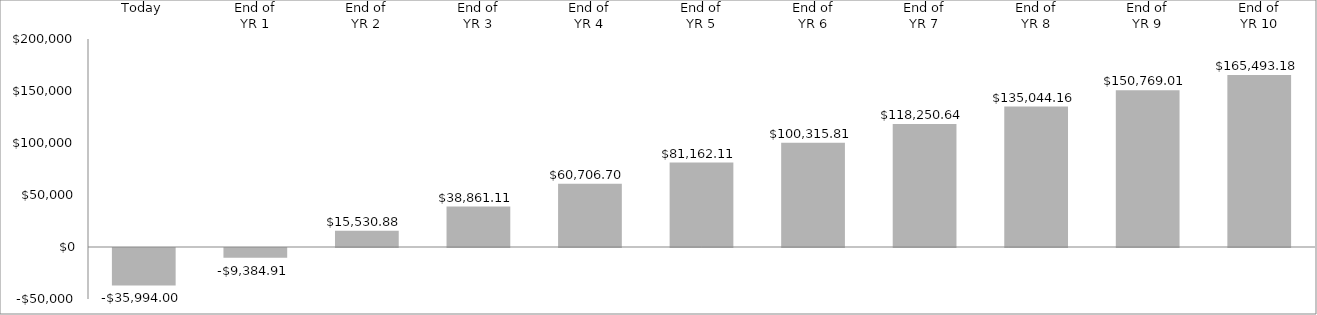
| Category | ($35,994.00) $26,609  $24,916  $23,330  $21,846  $20,455  $19,154  $17,935  $16,794  $15,725  $14,724  |
|---|---|
| Today | -35994 |
| End of
YR 1 | -9384.909 |
| End of
YR 2 | 15530.876 |
| End of
YR 3 | 38861.111 |
| End of
YR 4 | 60706.695 |
| End of
YR 5 | 81162.105 |
| End of
YR 6 | 100315.808 |
| End of
YR 7 | 118250.638 |
| End of
YR 8 | 135044.161 |
| End of
YR 9 | 150769.005 |
| End of
YR 10 | 165493.178 |